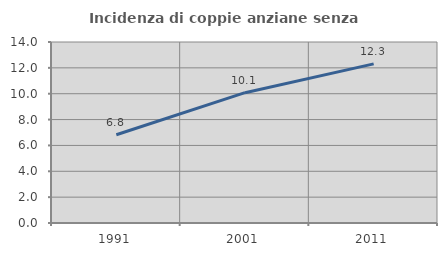
| Category | Incidenza di coppie anziane senza figli  |
|---|---|
| 1991.0 | 6.826 |
| 2001.0 | 10.08 |
| 2011.0 | 12.306 |